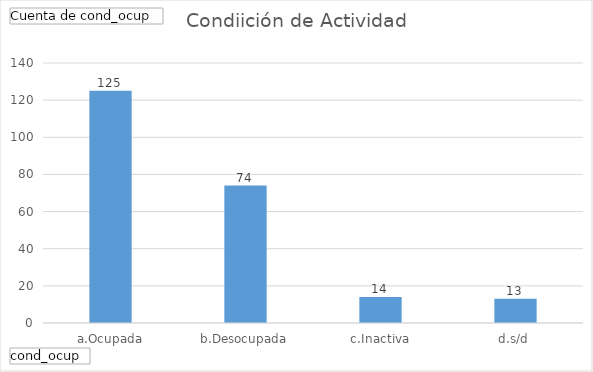
| Category | Total |
|---|---|
| a.Ocupada | 125 |
| b.Desocupada | 74 |
| c.Inactiva | 14 |
| d.s/d | 13 |